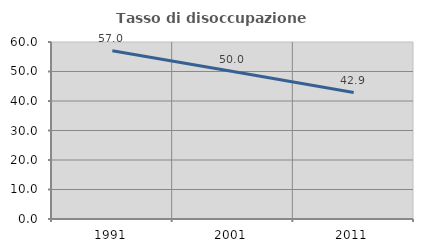
| Category | Tasso di disoccupazione giovanile  |
|---|---|
| 1991.0 | 57.009 |
| 2001.0 | 50 |
| 2011.0 | 42.857 |